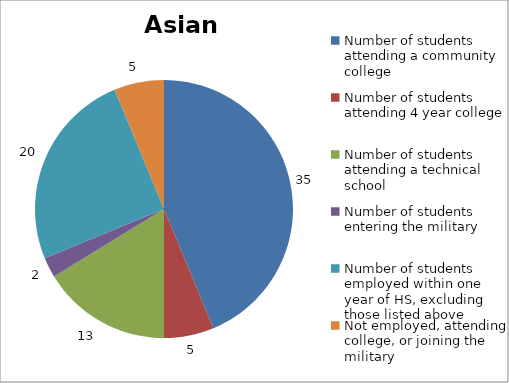
| Category | Asian American |
|---|---|
| Number of students attending a community college | 35 |
| Number of students attending 4 year college | 5 |
| Number of students attending a technical school | 13 |
| Number of students entering the military | 2 |
| Number of students employed within one year of HS, excluding those listed above | 20 |
| Not employed, attending college, or joining the military | 5 |